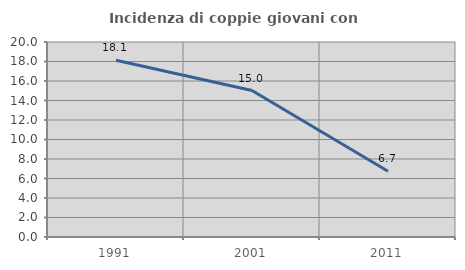
| Category | Incidenza di coppie giovani con figli |
|---|---|
| 1991.0 | 18.125 |
| 2001.0 | 15.025 |
| 2011.0 | 6.739 |